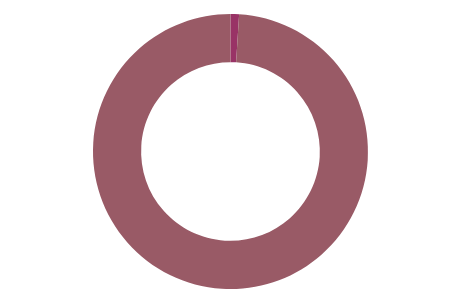
| Category | Series 0 |
|---|---|
| 0 | 1 |
| 1 | 99 |